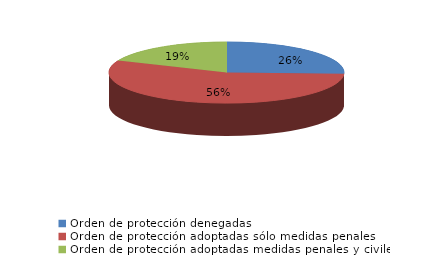
| Category | Series 0 |
|---|---|
| Orden de protección denegadas | 22 |
| Orden de protección adoptadas sólo medidas penales | 48 |
| Orden de protección adoptadas medidas penales y civiles | 16 |